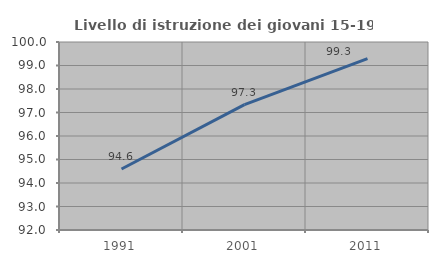
| Category | Livello di istruzione dei giovani 15-19 anni |
|---|---|
| 1991.0 | 94.595 |
| 2001.0 | 97.333 |
| 2011.0 | 99.296 |